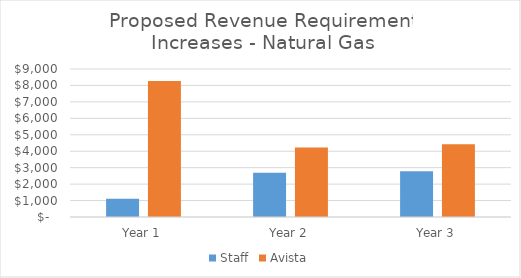
| Category | Staff | Avista |
|---|---|---|
| Year 1 | 1106.716 | 8269 |
| Year 2 | 2698.013 | 4220 |
| Year 3 | 2784.314 | 4417 |